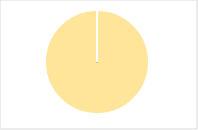
| Category | Total |
|---|---|
| Y | 0 |
| R | 0 |
| T | 0 |
| M | 0 |
| F | 0 |
| N | 34 |